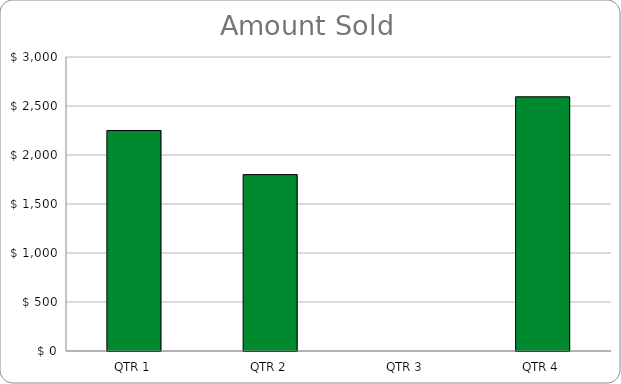
| Category | Amount Sales |
|---|---|
| QTR 1 | 2250 |
| QTR 2 | 1800 |
| QTR 3 | 0 |
| QTR 4 | 2594 |